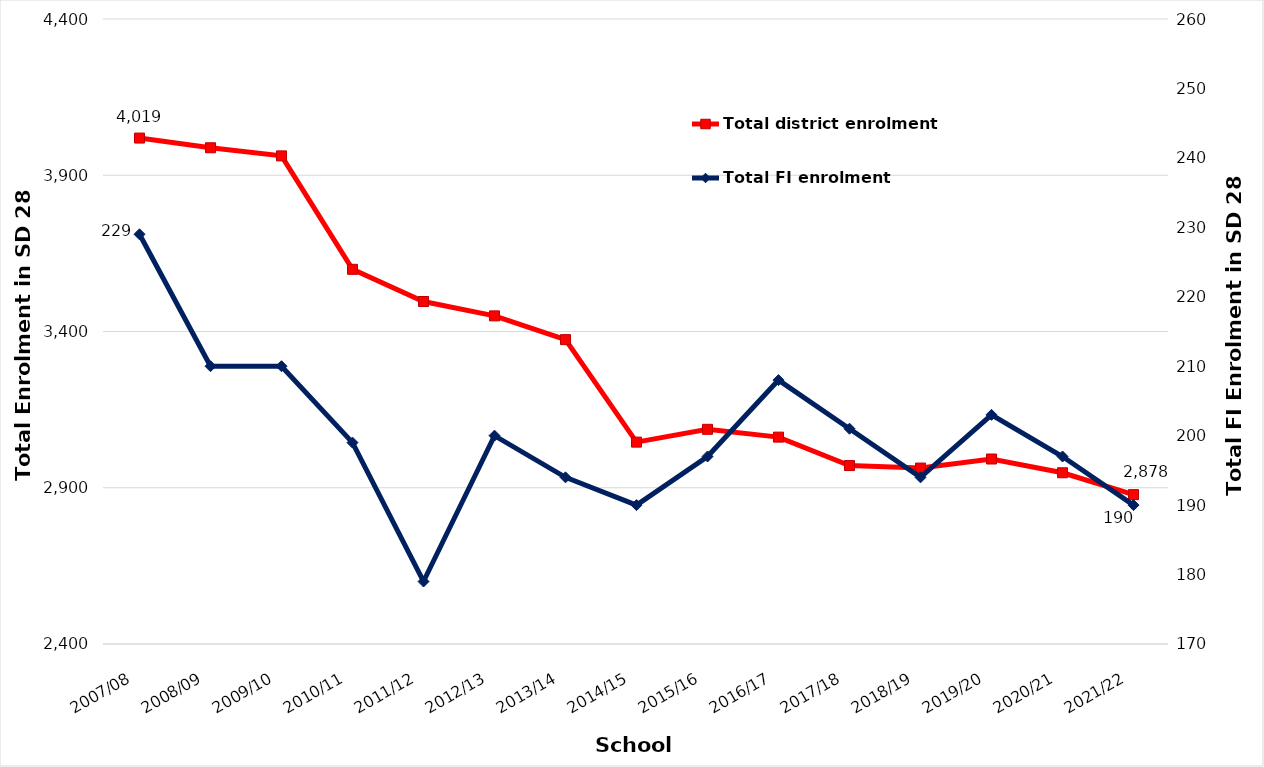
| Category | Total district enrolment  |
|---|---|
| 2007/08 | 4019 |
| 2008/09 | 3988 |
| 2009/10 | 3962 |
| 2010/11 | 3599 |
| 2011/12 | 3496 |
| 2012/13 | 3450 |
| 2013/14 | 3374 |
| 2014/15 | 3046 |
| 2015/16 | 3087 |
| 2016/17 | 3062 |
| 2017/18 | 2971 |
| 2018/19 | 2963 |
| 2019/20 | 2992 |
| 2020/21 | 2948 |
| 2021/22 | 2878 |